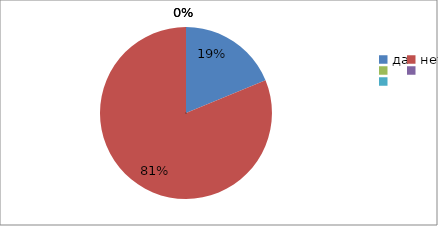
| Category | Series 0 | Series 1 |
|---|---|---|
| да | 18.8 | 18.8 |
| нет | 81.3 | 81.3 |